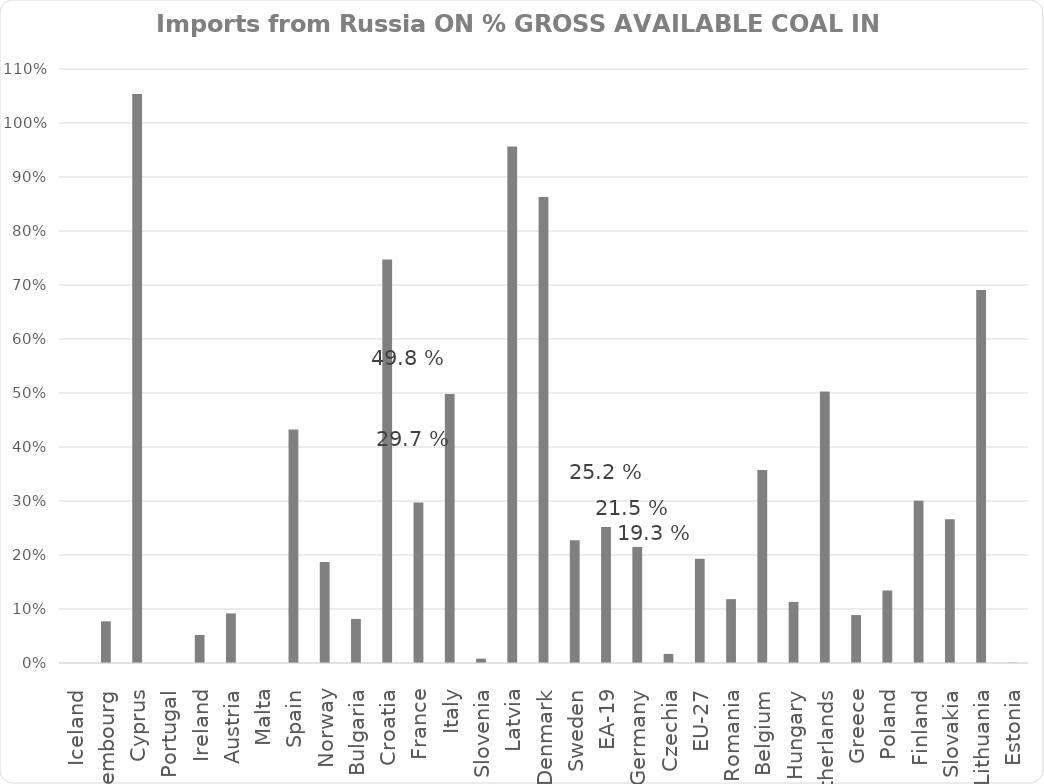
| Category | Coal |
|---|---|
| Iceland | 0 |
| Luxembourg | 0.077 |
| Cyprus | 1.054 |
| Portugal | 0 |
| Ireland | 0.052 |
| Austria | 0.092 |
| Malta | 0 |
| Spain | 0.432 |
| Norway | 0.187 |
| Bulgaria | 0.082 |
| Croatia | 0.747 |
| France | 0.297 |
| Italy | 0.498 |
| Slovenia | 0.008 |
| Latvia | 0.956 |
| Denmark | 0.863 |
| Sweden | 0.227 |
| EA-19 | 0.252 |
| Germany | 0.215 |
| Czechia | 0.017 |
| EU-27 | 0.193 |
| Romania | 0.118 |
| Belgium | 0.358 |
| Hungary | 0.113 |
| Netherlands | 0.503 |
| Greece | 0.089 |
| Poland | 0.134 |
| Finland | 0.3 |
| Slovakia | 0.266 |
| Lithuania | 0.691 |
| Estonia | 0.001 |